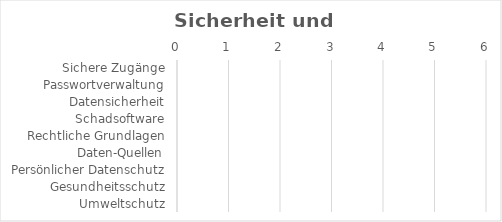
| Category | Sicherheit und Recht |
|---|---|
| Sichere Zugänge | 0 |
| Passwortverwaltung | 0 |
| Datensicherheit | 0 |
| Schadsoftware | 0 |
| Rechtliche Grundlagen | 0 |
| Daten-Quellen | 0 |
| Persönlicher Datenschutz | 0 |
| Gesundheitsschutz | 0 |
| Umweltschutz | 0 |